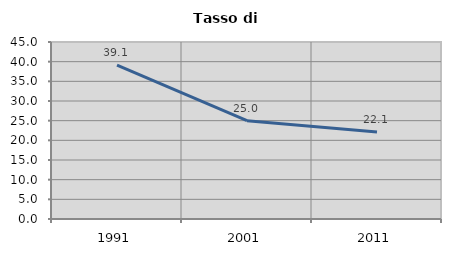
| Category | Tasso di disoccupazione   |
|---|---|
| 1991.0 | 39.121 |
| 2001.0 | 24.982 |
| 2011.0 | 22.136 |